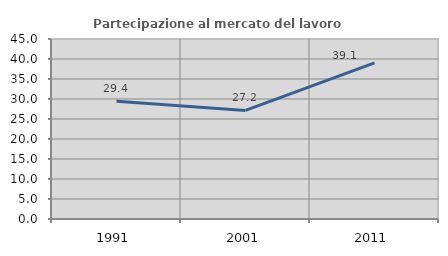
| Category | Partecipazione al mercato del lavoro  femminile |
|---|---|
| 1991.0 | 29.435 |
| 2001.0 | 27.15 |
| 2011.0 | 39.051 |